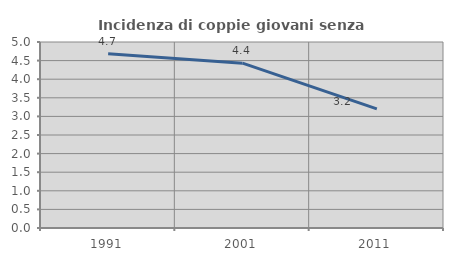
| Category | Incidenza di coppie giovani senza figli |
|---|---|
| 1991.0 | 4.685 |
| 2001.0 | 4.431 |
| 2011.0 | 3.203 |